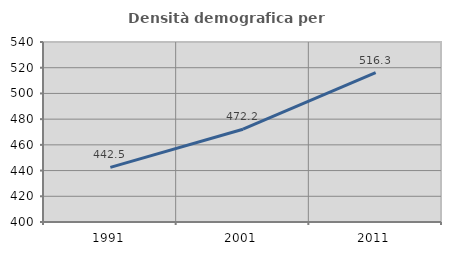
| Category | Densità demografica |
|---|---|
| 1991.0 | 442.464 |
| 2001.0 | 472.176 |
| 2011.0 | 516.267 |